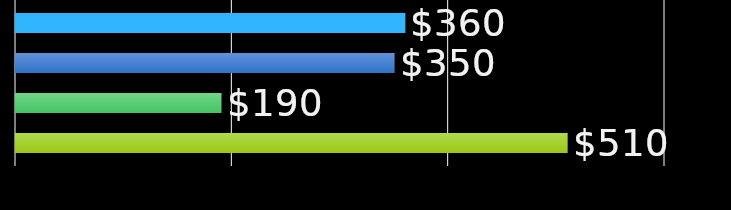
| Category | roommate 1 | roommate 2 | roommate 3 | roommate 4 |
|---|---|---|---|---|
| 0 | 360 | 350 | 190 | 510 |